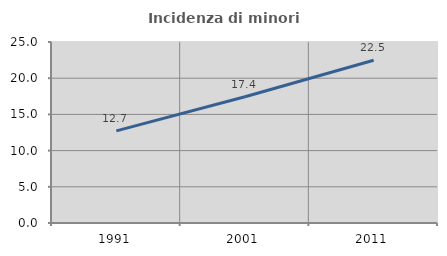
| Category | Incidenza di minori stranieri |
|---|---|
| 1991.0 | 12.727 |
| 2001.0 | 17.442 |
| 2011.0 | 22.482 |